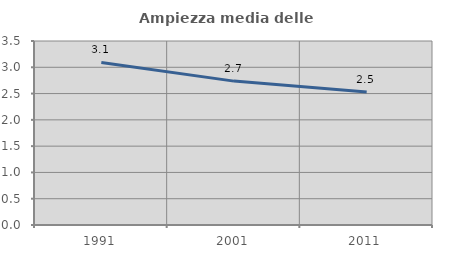
| Category | Ampiezza media delle famiglie |
|---|---|
| 1991.0 | 3.092 |
| 2001.0 | 2.737 |
| 2011.0 | 2.528 |